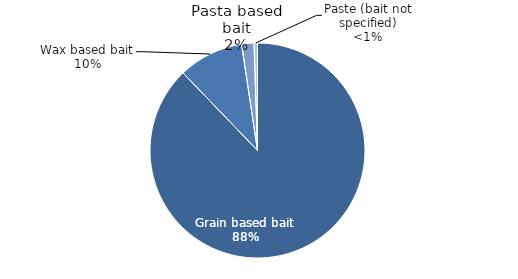
| Category | Series 0 |
|---|---|
| Grain based bait | 87.821 |
| Wax based bait | 9.813 |
| Pasta based bait | 1.85 |
| Paste (bait not specified) | 0.516 |